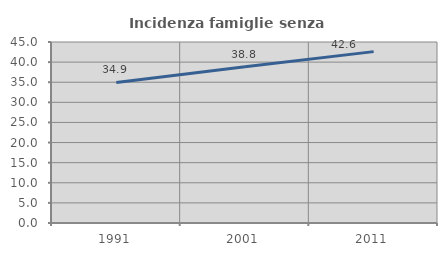
| Category | Incidenza famiglie senza nuclei |
|---|---|
| 1991.0 | 34.933 |
| 2001.0 | 38.819 |
| 2011.0 | 42.609 |